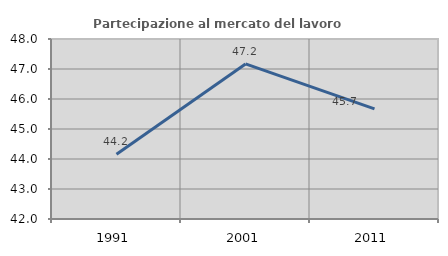
| Category | Partecipazione al mercato del lavoro  femminile |
|---|---|
| 1991.0 | 44.161 |
| 2001.0 | 47.17 |
| 2011.0 | 45.669 |